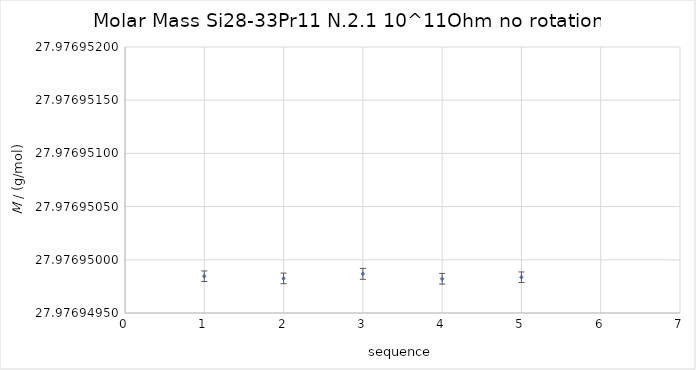
| Category | Series 0 |
|---|---|
| 0 | 27.977 |
| 1 | 27.977 |
| 2 | 27.977 |
| 3 | 27.977 |
| 4 | 27.977 |